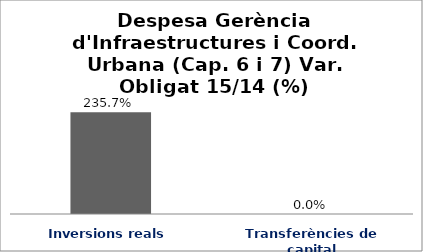
| Category | Series 0 |
|---|---|
| Inversions reals | 2.357 |
| Transferències de capital | 0 |